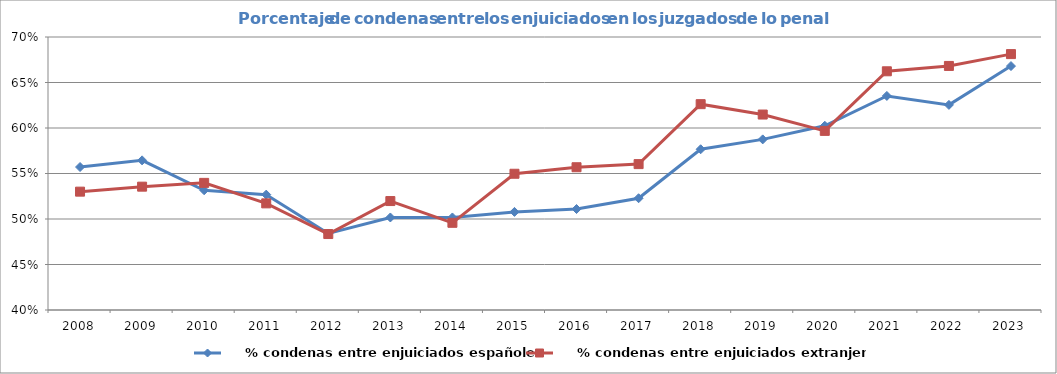
| Category |     % condenas entre enjuiciados españoles |     % condenas entre enjuiciados extranjeros |
|---|---|---|
| 2008.0 | 0.557 | 0.53 |
| 2009.0 | 0.564 | 0.536 |
| 2010.0 | 0.532 | 0.54 |
| 2011.0 | 0.527 | 0.517 |
| 2012.0 | 0.484 | 0.483 |
| 2013.0 | 0.502 | 0.52 |
| 2014.0 | 0.502 | 0.496 |
| 2015.0 | 0.508 | 0.55 |
| 2016.0 | 0.511 | 0.557 |
| 2017.0 | 0.523 | 0.56 |
| 2018.0 | 0.577 | 0.626 |
| 2019.0 | 0.587 | 0.615 |
| 2020.0 | 0.602 | 0.597 |
| 2021.0 | 0.635 | 0.662 |
| 2022.0 | 0.625 | 0.668 |
| 2023.0 | 0.668 | 0.681 |